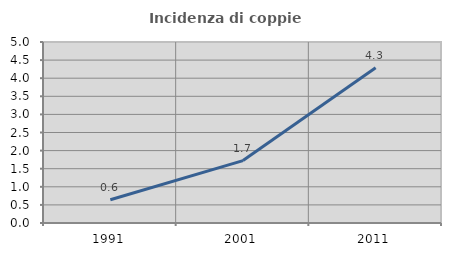
| Category | Incidenza di coppie miste |
|---|---|
| 1991.0 | 0.643 |
| 2001.0 | 1.724 |
| 2011.0 | 4.291 |